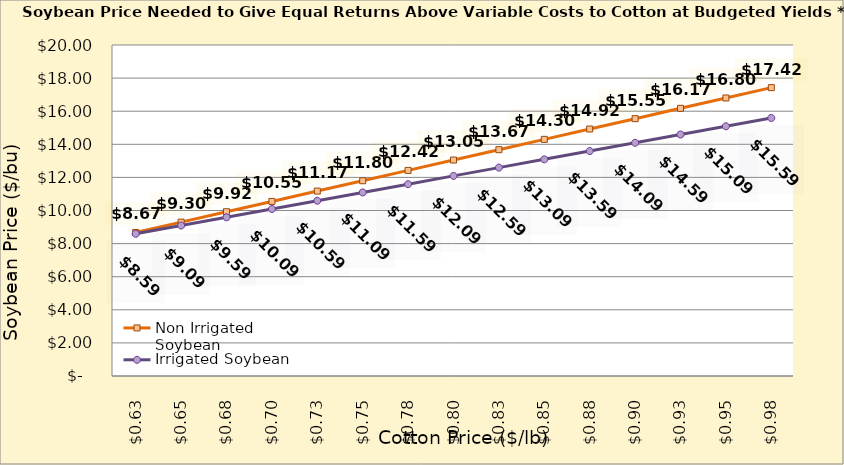
| Category | Non Irrigated Soybean | Irrigated Soybean |
|---|---|---|
| 0.6249999999999999 | 8.674 | 8.591 |
| 0.6499999999999999 | 9.299 | 9.091 |
| 0.6749999999999999 | 9.924 | 9.591 |
| 0.7 | 10.549 | 10.091 |
| 0.725 | 11.174 | 10.591 |
| 0.75 | 11.799 | 11.091 |
| 0.775 | 12.424 | 11.591 |
| 0.8 | 13.049 | 12.091 |
| 0.8250000000000001 | 13.674 | 12.591 |
| 0.8500000000000001 | 14.299 | 13.091 |
| 0.8750000000000001 | 14.924 | 13.591 |
| 0.9000000000000001 | 15.549 | 14.091 |
| 0.9250000000000002 | 16.174 | 14.591 |
| 0.9500000000000002 | 16.799 | 15.091 |
| 0.9750000000000002 | 17.424 | 15.591 |